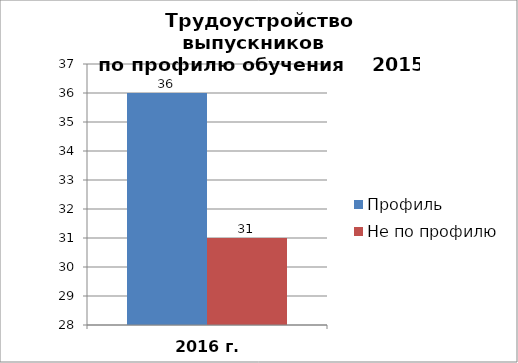
| Category | Профиль | Не по профилю |
|---|---|---|
| 2016 г. | 36 | 31 |